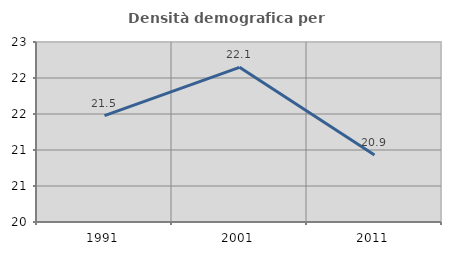
| Category | Densità demografica |
|---|---|
| 1991.0 | 21.477 |
| 2001.0 | 22.149 |
| 2011.0 | 20.93 |